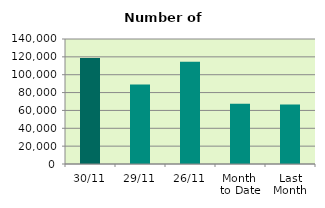
| Category | Series 0 |
|---|---|
| 30/11 | 118652 |
| 29/11 | 88906 |
| 26/11 | 114438 |
| Month 
to Date | 67470.455 |
| Last
Month | 66688.857 |